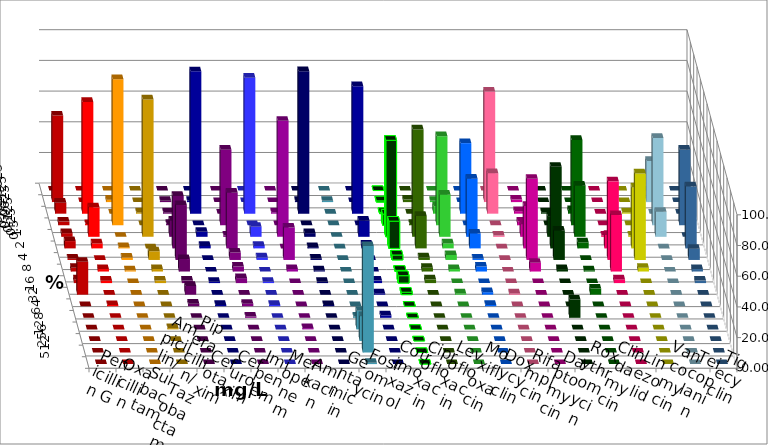
| Category | Penicillin G | Oxacillin | Ampicillin/ Sulbactam | Piperacillin/ Tazobactam | Cefotaxim | Cefuroxim | Imipenem | Meropenem | Amikacin | Gentamicin | Fosfomycin | Cotrimoxazol | Ciprofloxacin | Levofloxacin | Moxifloxacin | Doxycyclin | Rifampicin | Daptomycin | Roxythromycin | Clindamycin | Linezolid | Vancomycin | Teicoplanin | Tigecyclin |
|---|---|---|---|---|---|---|---|---|---|---|---|---|---|---|---|---|---|---|---|---|---|---|---|---|
| 0.015625 | 0 | 0 | 0 | 0 | 0 | 0 | 0 | 0 | 0 | 0 | 0 | 0 | 0 | 0 | 0 | 0 | 0 | 0 | 0 | 0 | 0 | 0 | 0 | 0 |
| 0.03125 | 56.349 | 0 | 1.6 | 0 | 0.813 | 0 | 0.806 | 0 | 0 | 0.8 | 0.806 | 0 | 0.806 | 1.626 | 0.806 | 0 | 72 | 1.626 | 0 | 0 | 0 | 0 | 0 | 26.829 |
| 0.0625 | 7.143 | 72.8 | 0 | 0.806 | 0.813 | 0 | 92.742 | 88.618 | 0.813 | 92.8 | 0 | 83.065 | 0.806 | 0 | 4.839 | 45.968 | 26.4 | 1.626 | 0.794 | 2.381 | 0 | 0.794 | 0 | 0 |
| 0.125 | 2.381 | 0.8 | 95.2 | 0 | 0.813 | 49.194 | 0 | 0 | 0 | 0 | 0 | 0 | 7.258 | 0.813 | 58.065 | 0 | 0 | 2.439 | 0 | 55.556 | 0 | 0 | 49.194 | 56.911 |
| 0.25 | 2.381 | 19.2 | 0 | 89.516 | 10.569 | 0.806 | 3.226 | 6.504 | 75.61 | 2.4 | 0 | 10.484 | 62.903 | 69.919 | 27.419 | 37.903 | 0.8 | 8.13 | 13.492 | 33.333 | 0.8 | 0.794 | 0 | 16.26 |
| 0.5 | 4.762 | 3.2 | 0.8 | 0 | 34.146 | 36.29 | 1.613 | 1.626 | 0 | 0.8 | 0 | 2.419 | 17.742 | 21.138 | 3.226 | 9.677 | 0 | 27.642 | 53.175 | 3.968 | 8.8 | 39.683 | 40.323 | 0 |
| 1.0 | 0.794 | 0 | 1.6 | 5.645 | 35.772 | 4.839 | 0 | 1.626 | 21.138 | 0.8 | 0 | 0 | 3.226 | 1.626 | 3.226 | 0.806 | 0 | 52.846 | 19.048 | 0 | 51.2 | 56.349 | 7.258 | 0 |
| 2.0 | 2.381 | 1.6 | 0.8 | 1.613 | 8.13 | 3.226 | 0 | 0 | 1.626 | 0.8 | 0 | 0 | 0.806 | 2.439 | 1.613 | 3.226 | 0 | 5.691 | 1.587 | 0.794 | 36.8 | 2.381 | 1.613 | 0 |
| 4.0 | 2.381 | 1.6 | 0 | 1.613 | 1.626 | 3.226 | 0.806 | 0.813 | 0 | 0.8 | 0 | 1.613 | 4.839 | 2.439 | 0 | 0 | 0 | 0 | 0 | 0 | 2.4 | 0 | 1.613 | 0 |
| 8.0 | 21.429 | 0 | 0 | 0 | 5.691 | 0 | 0 | 0 | 0 | 0 | 0 | 0.806 | 1.613 | 0 | 0.806 | 1.613 | 0.8 | 0 | 0 | 3.968 | 0 | 0 | 0 | 0 |
| 16.0 | 0 | 0.8 | 0 | 0 | 1.626 | 1.613 | 0.806 | 0.813 | 0 | 0.8 | 0 | 0 | 0 | 0 | 0 | 0.806 | 0 | 0 | 0 | 0 | 0 | 0 | 0 | 0 |
| 32.0 | 0 | 0 | 0 | 0 | 0 | 0.806 | 0 | 0 | 0 | 0 | 0.806 | 1.613 | 0 | 0 | 0 | 0 | 0 | 0 | 11.905 | 0 | 0 | 0 | 0 | 0 |
| 64.0 | 0 | 0 | 0 | 0.806 | 0 | 0 | 0 | 0 | 0.813 | 0 | 12.097 | 0 | 0 | 0 | 0 | 0 | 0 | 0 | 0 | 0 | 0 | 0 | 0 | 0 |
| 128.0 | 0 | 0 | 0 | 0 | 0 | 0 | 0 | 0 | 0 | 0 | 16.129 | 0 | 0 | 0 | 0 | 0 | 0 | 0 | 0 | 0 | 0 | 0 | 0 | 0 |
| 256.0 | 0 | 0 | 0 | 0 | 0 | 0 | 0 | 0 | 0 | 0 | 69.355 | 0 | 0 | 0 | 0 | 0 | 0 | 0 | 0 | 0 | 0 | 0 | 0 | 0 |
| 512.0 | 0 | 0 | 0 | 0 | 0 | 0 | 0 | 0 | 0 | 0 | 0.806 | 0 | 0 | 0 | 0 | 0 | 0 | 0 | 0 | 0 | 0 | 0 | 0 | 0 |